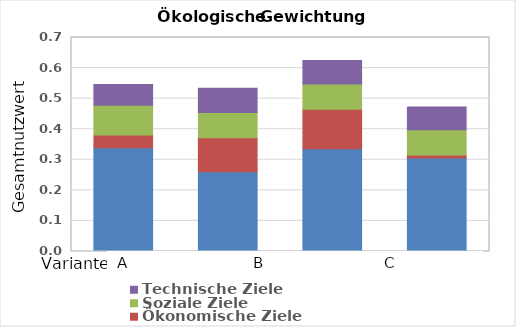
| Category | Umwelt- und Ressourcenschutz | Ökonomische Ziele | Soziale Ziele | Technische Ziele |
|---|---|---|---|---|
| 0 | 0.339 | 0.041 | 0.098 | 0.068 |
| 1 | 0.261 | 0.111 | 0.082 | 0.079 |
| 2 | 0.336 | 0.129 | 0.082 | 0.077 |
| 3 | 0.306 | 0.01 | 0.082 | 0.074 |